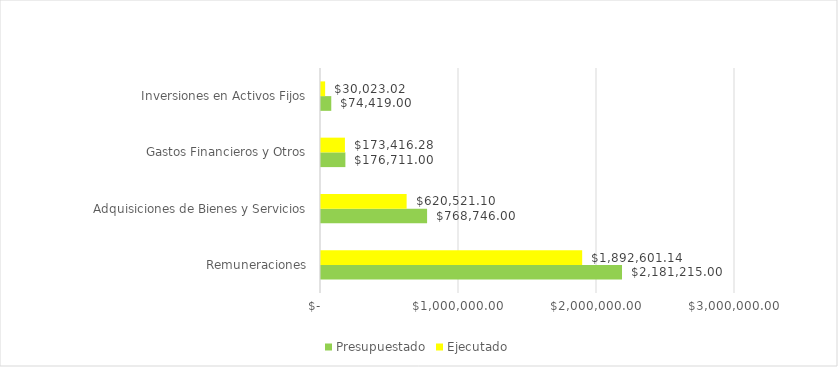
| Category |  Presupuestado  |  Ejecutado  |
|---|---|---|
| Remuneraciones | 2181215 | 1892601.14 |
| Adquisiciones de Bienes y Servicios | 768746 | 620521.1 |
| Gastos Financieros y Otros | 176711 | 173416.28 |
| Inversiones en Activos Fijos | 74419 | 30023.02 |